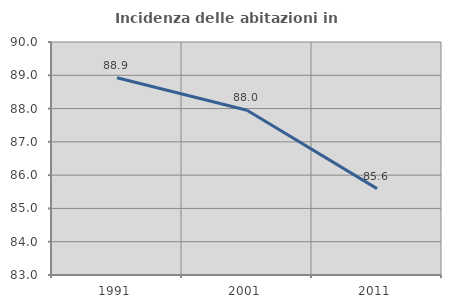
| Category | Incidenza delle abitazioni in proprietà  |
|---|---|
| 1991.0 | 88.925 |
| 2001.0 | 87.95 |
| 2011.0 | 85.596 |